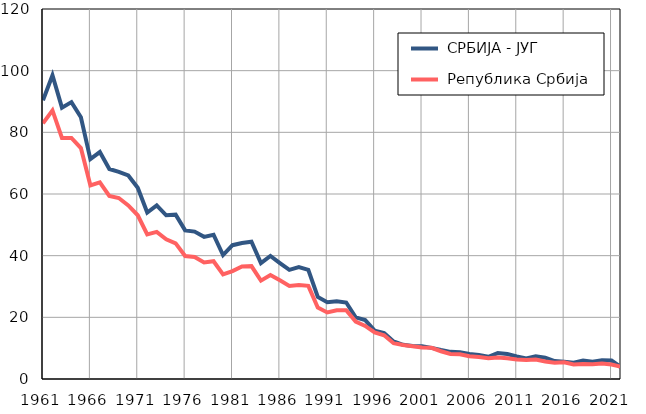
| Category |  СРБИЈА - ЈУГ |  Република Србија |
|---|---|---|
| 1961.0 | 90.4 | 82.9 |
| 1962.0 | 98.5 | 87.1 |
| 1963.0 | 88 | 78.2 |
| 1964.0 | 89.8 | 78.2 |
| 1965.0 | 84.9 | 74.9 |
| 1966.0 | 71.3 | 62.8 |
| 1967.0 | 73.6 | 63.8 |
| 1968.0 | 68.1 | 59.4 |
| 1969.0 | 67.2 | 58.7 |
| 1970.0 | 66 | 56.3 |
| 1971.0 | 62 | 53.1 |
| 1972.0 | 54 | 46.9 |
| 1973.0 | 56.3 | 47.7 |
| 1974.0 | 53.1 | 45.3 |
| 1975.0 | 53.3 | 44 |
| 1976.0 | 48.2 | 39.9 |
| 1977.0 | 47.8 | 39.6 |
| 1978.0 | 46.1 | 37.8 |
| 1979.0 | 46.8 | 38.2 |
| 1980.0 | 40.2 | 33.9 |
| 1981.0 | 43.4 | 35 |
| 1982.0 | 44.1 | 36.5 |
| 1983.0 | 44.5 | 36.6 |
| 1984.0 | 37.6 | 31.9 |
| 1985.0 | 39.9 | 33.7 |
| 1986.0 | 37.6 | 32 |
| 1987.0 | 35.4 | 30.2 |
| 1988.0 | 36.3 | 30.5 |
| 1989.0 | 35.4 | 30.2 |
| 1990.0 | 26.6 | 23.2 |
| 1991.0 | 24.9 | 21.6 |
| 1992.0 | 25.2 | 22.3 |
| 1993.0 | 24.8 | 22.3 |
| 1994.0 | 20 | 18.6 |
| 1995.0 | 19.1 | 17.2 |
| 1996.0 | 15.7 | 15.1 |
| 1997.0 | 14.9 | 14.2 |
| 1998.0 | 12.2 | 11.6 |
| 1999.0 | 11.1 | 11 |
| 2000.0 | 10.7 | 10.6 |
| 2001.0 | 10.6 | 10.2 |
| 2002.0 | 10.1 | 10.1 |
| 2003.0 | 9.4 | 9 |
| 2004.0 | 8.8 | 8.1 |
| 2005.0 | 8.7 | 8 |
| 2006.0 | 8.1 | 7.4 |
| 2007.0 | 7.8 | 7.1 |
| 2008.0 | 7.2 | 6.7 |
| 2009.0 | 8.4 | 7 |
| 2010.0 | 8.1 | 6.7 |
| 2011.0 | 7.3 | 6.3 |
| 2012.0 | 6.7 | 6.2 |
| 2013.0 | 7.4 | 6.3 |
| 2014.0 | 6.9 | 5.7 |
| 2015.0 | 5.8 | 5.3 |
| 2016.0 | 5.6 | 5.4 |
| 2017.0 | 5.3 | 4.7 |
| 2018.0 | 6 | 4.9 |
| 2019.0 | 5.6 | 4.8 |
| 2020.0 | 6.1 | 5 |
| 2021.0 | 6 | 4.7 |
| 2022.0 | 3.8 | 4 |